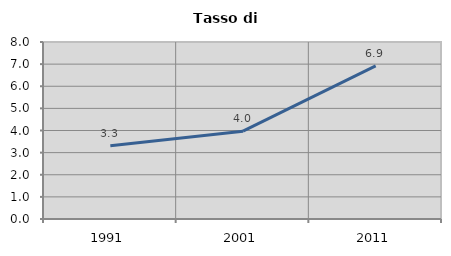
| Category | Tasso di disoccupazione   |
|---|---|
| 1991.0 | 3.313 |
| 2001.0 | 3.968 |
| 2011.0 | 6.925 |